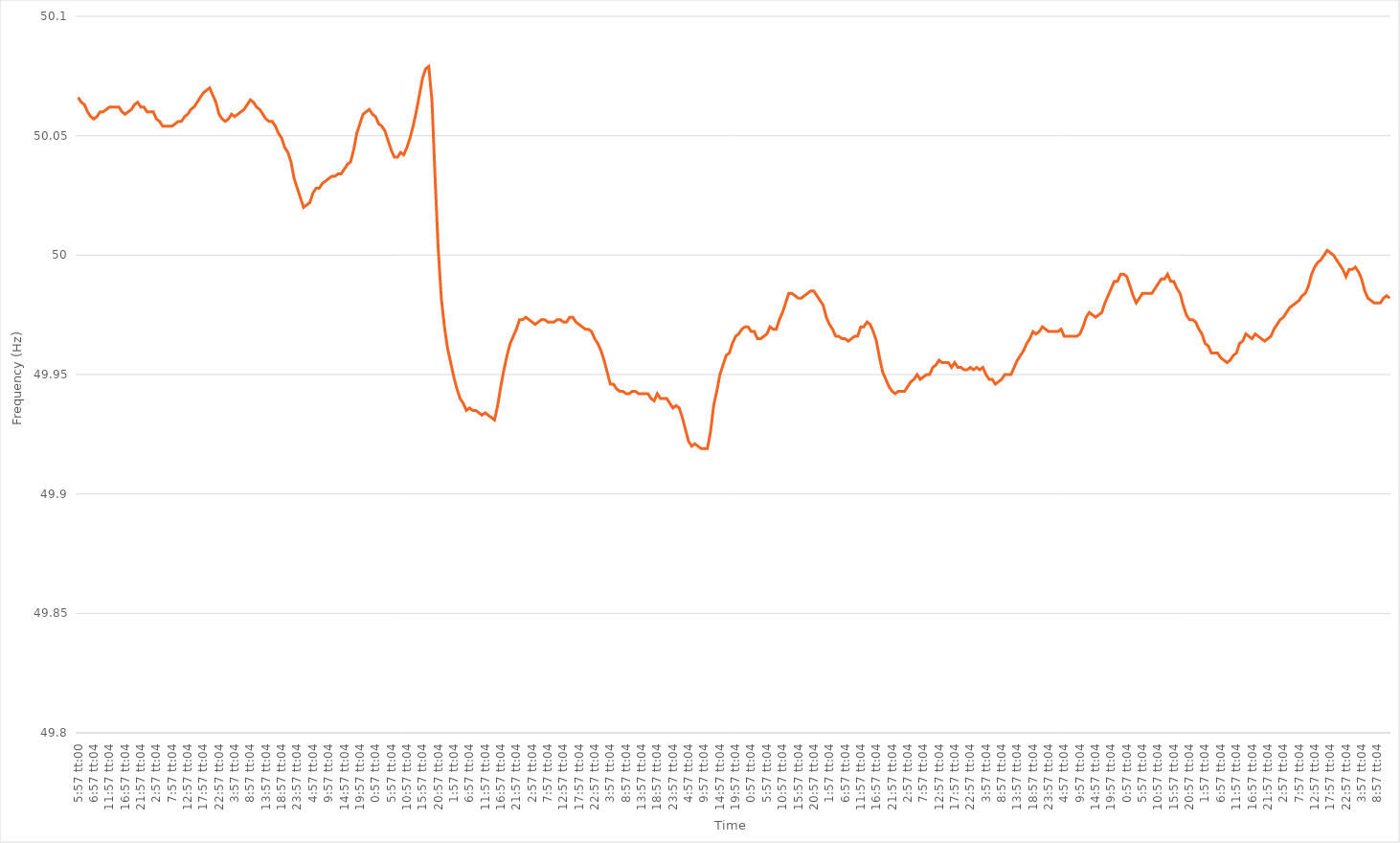
| Category | Series 0 |
|---|---|
| 0.24791666666666667 | 50.066 |
| 0.24792824074074074 | 50.064 |
| 0.24793981481481484 | 50.063 |
| 0.2479513888888889 | 50.06 |
| 0.24796296296296297 | 50.058 |
| 0.28962962962963 | 50.057 |
| 0.331296296296296 | 50.058 |
| 0.372962962962963 | 50.06 |
| 0.41462962962963 | 50.06 |
| 0.456296296296296 | 50.061 |
| 0.497962962962963 | 50.062 |
| 0.53962962962963 | 50.062 |
| 0.581296296296296 | 50.062 |
| 0.622962962962963 | 50.062 |
| 0.66462962962963 | 50.06 |
| 0.706296296296296 | 50.059 |
| 0.747962962962963 | 50.06 |
| 0.78962962962963 | 50.061 |
| 0.831296296296296 | 50.063 |
| 0.872962962962963 | 50.064 |
| 0.91462962962963 | 50.062 |
| 0.956296296296296 | 50.062 |
| 0.997962962962963 | 50.06 |
| 1900-01-01 00:57:04 | 50.06 |
| 1900-01-01 01:57:04 | 50.06 |
| 1900-01-01 02:57:04 | 50.057 |
| 1900-01-01 03:57:04 | 50.056 |
| 1900-01-01 04:57:04 | 50.054 |
| 1900-01-01 05:57:04 | 50.054 |
| 1900-01-01 06:57:04 | 50.054 |
| 1900-01-01 07:57:04 | 50.054 |
| 1900-01-01 08:57:04 | 50.055 |
| 1900-01-01 09:57:04 | 50.056 |
| 1900-01-01 10:57:04 | 50.056 |
| 1900-01-01 11:57:04 | 50.058 |
| 1900-01-01 12:57:04 | 50.059 |
| 1900-01-01 13:57:04 | 50.061 |
| 1900-01-01 14:57:04 | 50.062 |
| 1900-01-01 15:57:04 | 50.064 |
| 1900-01-01 16:57:04 | 50.066 |
| 1900-01-01 17:57:04 | 50.068 |
| 1900-01-01 18:57:04 | 50.069 |
| 1900-01-01 19:57:04 | 50.07 |
| 1900-01-01 20:57:04 | 50.067 |
| 1900-01-01 21:57:04 | 50.064 |
| 1900-01-01 22:57:04 | 50.059 |
| 1900-01-01 23:57:04 | 50.057 |
| 1900-01-02 00:57:04 | 50.056 |
| 1900-01-02 01:57:04 | 50.057 |
| 1900-01-02 02:57:04 | 50.059 |
| 1900-01-02 03:57:04 | 50.058 |
| 1900-01-02 04:57:04 | 50.059 |
| 1900-01-02 05:57:04 | 50.06 |
| 1900-01-02 06:57:04 | 50.061 |
| 1900-01-02 07:57:04 | 50.063 |
| 1900-01-02 08:57:04 | 50.065 |
| 1900-01-02 09:57:04 | 50.064 |
| 1900-01-02 10:57:04 | 50.062 |
| 1900-01-02 11:57:04 | 50.061 |
| 1900-01-02 12:57:04 | 50.059 |
| 1900-01-02 13:57:04 | 50.057 |
| 1900-01-02 14:57:04 | 50.056 |
| 1900-01-02 15:57:04 | 50.056 |
| 1900-01-02 16:57:04 | 50.054 |
| 1900-01-02 17:57:04 | 50.051 |
| 1900-01-02 18:57:04 | 50.049 |
| 1900-01-02 19:57:04 | 50.045 |
| 1900-01-02 20:57:04 | 50.043 |
| 1900-01-02 21:57:04 | 50.039 |
| 1900-01-02 22:57:04 | 50.032 |
| 1900-01-02 23:57:04 | 50.028 |
| 1900-01-03 00:57:04 | 50.024 |
| 1900-01-03 01:57:04 | 50.02 |
| 1900-01-03 02:57:04 | 50.021 |
| 1900-01-03 03:57:04 | 50.022 |
| 1900-01-03 04:57:04 | 50.026 |
| 1900-01-03 05:57:04 | 50.028 |
| 1900-01-03 06:57:04 | 50.028 |
| 1900-01-03 07:57:04 | 50.03 |
| 1900-01-03 08:57:04 | 50.031 |
| 1900-01-03 09:57:04 | 50.032 |
| 1900-01-03 10:57:04 | 50.033 |
| 1900-01-03 11:57:04 | 50.033 |
| 1900-01-03 12:57:04 | 50.034 |
| 1900-01-03 13:57:04 | 50.034 |
| 1900-01-03 14:57:04 | 50.036 |
| 1900-01-03 15:57:04 | 50.038 |
| 1900-01-03 16:57:04 | 50.039 |
| 1900-01-03 17:57:04 | 50.044 |
| 1900-01-03 18:57:04 | 50.051 |
| 1900-01-03 19:57:04 | 50.055 |
| 1900-01-03 20:57:04 | 50.059 |
| 1900-01-03 21:57:04 | 50.06 |
| 1900-01-03 22:57:04 | 50.061 |
| 1900-01-03 23:57:04 | 50.059 |
| 1900-01-04 00:57:04 | 50.058 |
| 1900-01-04 01:57:04 | 50.055 |
| 1900-01-04 02:57:04 | 50.054 |
| 1900-01-04 03:57:04 | 50.052 |
| 1900-01-04 04:57:04 | 50.048 |
| 1900-01-04 05:57:04 | 50.044 |
| 1900-01-04 06:57:04 | 50.041 |
| 1900-01-04 07:57:04 | 50.041 |
| 1900-01-04 08:57:04 | 50.043 |
| 1900-01-04 09:57:04 | 50.042 |
| 1900-01-04 10:57:04 | 50.045 |
| 1900-01-04 11:57:04 | 50.049 |
| 1900-01-04 12:57:04 | 50.054 |
| 1900-01-04 13:57:04 | 50.06 |
| 1900-01-04 14:57:04 | 50.067 |
| 1900-01-04 15:57:04 | 50.074 |
| 1900-01-04 16:57:04 | 50.078 |
| 1900-01-04 17:57:04 | 50.079 |
| 1900-01-04 18:57:04 | 50.065 |
| 1900-01-04 19:57:04 | 50.033 |
| 1900-01-04 20:57:04 | 50.003 |
| 1900-01-04 21:57:04 | 49.982 |
| 1900-01-04 22:57:04 | 49.97 |
| 1900-01-04 23:57:04 | 49.961 |
| 1900-01-05 00:57:04 | 49.955 |
| 1900-01-05 01:57:04 | 49.949 |
| 1900-01-05 02:57:04 | 49.944 |
| 1900-01-05 03:57:04 | 49.94 |
| 1900-01-05 04:57:04 | 49.938 |
| 1900-01-05 05:57:04 | 49.935 |
| 1900-01-05 06:57:04 | 49.936 |
| 1900-01-05 07:57:04 | 49.935 |
| 1900-01-05 08:57:04 | 49.935 |
| 1900-01-05 09:57:04 | 49.934 |
| 1900-01-05 10:57:04 | 49.933 |
| 1900-01-05 11:57:04 | 49.934 |
| 1900-01-05 12:57:04 | 49.933 |
| 1900-01-05 13:57:04 | 49.932 |
| 1900-01-05 14:57:04 | 49.931 |
| 1900-01-05 15:57:04 | 49.937 |
| 1900-01-05 16:57:04 | 49.945 |
| 1900-01-05 17:57:04 | 49.952 |
| 1900-01-05 18:57:04 | 49.958 |
| 1900-01-05 19:57:04 | 49.963 |
| 1900-01-05 20:57:04 | 49.966 |
| 1900-01-05 21:57:04 | 49.969 |
| 1900-01-05 22:57:04 | 49.973 |
| 1900-01-05 23:57:04 | 49.973 |
| 1900-01-06 00:57:04 | 49.974 |
| 1900-01-06 01:57:04 | 49.973 |
| 1900-01-06 02:57:04 | 49.972 |
| 1900-01-06 03:57:04 | 49.971 |
| 1900-01-06 04:57:04 | 49.972 |
| 1900-01-06 05:57:04 | 49.973 |
| 1900-01-06 06:57:04 | 49.973 |
| 1900-01-06 07:57:04 | 49.972 |
| 1900-01-06 08:57:04 | 49.972 |
| 1900-01-06 09:57:04 | 49.972 |
| 1900-01-06 10:57:04 | 49.973 |
| 1900-01-06 11:57:04 | 49.973 |
| 1900-01-06 12:57:04 | 49.972 |
| 1900-01-06 13:57:04 | 49.972 |
| 1900-01-06 14:57:04 | 49.974 |
| 1900-01-06 15:57:04 | 49.974 |
| 1900-01-06 16:57:04 | 49.972 |
| 1900-01-06 17:57:04 | 49.971 |
| 1900-01-06 18:57:04 | 49.97 |
| 1900-01-06 19:57:04 | 49.969 |
| 1900-01-06 20:57:04 | 49.969 |
| 1900-01-06 21:57:04 | 49.968 |
| 1900-01-06 22:57:04 | 49.965 |
| 1900-01-06 23:57:04 | 49.963 |
| 1900-01-07 00:57:04 | 49.96 |
| 1900-01-07 01:57:04 | 49.956 |
| 1900-01-07 02:57:04 | 49.951 |
| 1900-01-07 03:57:04 | 49.946 |
| 1900-01-07 04:57:04 | 49.946 |
| 1900-01-07 05:57:04 | 49.944 |
| 1900-01-07 06:57:04 | 49.943 |
| 1900-01-07 07:57:04 | 49.943 |
| 1900-01-07 08:57:04 | 49.942 |
| 1900-01-07 09:57:04 | 49.942 |
| 1900-01-07 10:57:04 | 49.943 |
| 1900-01-07 11:57:04 | 49.943 |
| 1900-01-07 12:57:04 | 49.942 |
| 1900-01-07 13:57:04 | 49.942 |
| 1900-01-07 14:57:04 | 49.942 |
| 1900-01-07 15:57:04 | 49.942 |
| 1900-01-07 16:57:04 | 49.94 |
| 1900-01-07 17:57:04 | 49.939 |
| 1900-01-07 18:57:04 | 49.942 |
| 1900-01-07 19:57:04 | 49.94 |
| 1900-01-07 20:57:04 | 49.94 |
| 1900-01-07 21:57:04 | 49.94 |
| 1900-01-07 22:57:04 | 49.938 |
| 1900-01-07 23:57:04 | 49.936 |
| 1900-01-08 00:57:04 | 49.937 |
| 1900-01-08 01:57:04 | 49.936 |
| 1900-01-08 02:57:04 | 49.932 |
| 1900-01-08 03:57:04 | 49.927 |
| 1900-01-08 04:57:04 | 49.922 |
| 1900-01-08 05:57:04 | 49.92 |
| 1900-01-08 06:57:04 | 49.921 |
| 1900-01-08 07:57:04 | 49.92 |
| 1900-01-08 08:57:04 | 49.919 |
| 1900-01-08 09:57:04 | 49.919 |
| 1900-01-08 10:57:04 | 49.919 |
| 1900-01-08 11:57:04 | 49.926 |
| 1900-01-08 12:57:04 | 49.937 |
| 1900-01-08 13:57:04 | 49.943 |
| 1900-01-08 14:57:04 | 49.95 |
| 1900-01-08 15:57:04 | 49.954 |
| 1900-01-08 16:57:04 | 49.958 |
| 1900-01-08 17:57:04 | 49.959 |
| 1900-01-08 18:57:04 | 49.963 |
| 1900-01-08 19:57:04 | 49.966 |
| 1900-01-08 20:57:04 | 49.967 |
| 1900-01-08 21:57:04 | 49.969 |
| 1900-01-08 22:57:04 | 49.97 |
| 1900-01-08 23:57:04 | 49.97 |
| 1900-01-09 00:57:04 | 49.968 |
| 1900-01-09 01:57:04 | 49.968 |
| 1900-01-09 02:57:04 | 49.965 |
| 1900-01-09 03:57:04 | 49.965 |
| 1900-01-09 04:57:04 | 49.966 |
| 1900-01-09 05:57:04 | 49.967 |
| 1900-01-09 06:57:04 | 49.97 |
| 1900-01-09 07:57:04 | 49.969 |
| 1900-01-09 08:57:04 | 49.969 |
| 1900-01-09 09:57:04 | 49.973 |
| 1900-01-09 10:57:04 | 49.976 |
| 1900-01-09 11:57:04 | 49.98 |
| 1900-01-09 12:57:04 | 49.984 |
| 1900-01-09 13:57:04 | 49.984 |
| 1900-01-09 14:57:04 | 49.983 |
| 1900-01-09 15:57:04 | 49.982 |
| 1900-01-09 16:57:04 | 49.982 |
| 1900-01-09 17:57:04 | 49.983 |
| 1900-01-09 18:57:04 | 49.984 |
| 1900-01-09 19:57:04 | 49.985 |
| 1900-01-09 20:57:04 | 49.985 |
| 1900-01-09 21:57:04 | 49.983 |
| 1900-01-09 22:57:04 | 49.981 |
| 1900-01-09 23:57:04 | 49.979 |
| 1900-01-10 00:57:04 | 49.974 |
| 1900-01-10 01:57:04 | 49.971 |
| 1900-01-10 02:57:04 | 49.969 |
| 1900-01-10 03:57:04 | 49.966 |
| 1900-01-10 04:57:04 | 49.966 |
| 1900-01-10 05:57:04 | 49.965 |
| 1900-01-10 06:57:04 | 49.965 |
| 1900-01-10 07:57:04 | 49.964 |
| 1900-01-10 08:57:04 | 49.965 |
| 1900-01-10 09:57:04 | 49.966 |
| 1900-01-10 10:57:04 | 49.966 |
| 1900-01-10 11:57:04 | 49.97 |
| 1900-01-10 12:57:04 | 49.97 |
| 1900-01-10 13:57:04 | 49.972 |
| 1900-01-10 14:57:04 | 49.971 |
| 1900-01-10 15:57:04 | 49.968 |
| 1900-01-10 16:57:04 | 49.964 |
| 1900-01-10 17:57:04 | 49.957 |
| 1900-01-10 18:57:04 | 49.951 |
| 1900-01-10 19:57:04 | 49.948 |
| 1900-01-10 20:57:04 | 49.945 |
| 1900-01-10 21:57:04 | 49.943 |
| 1900-01-10 22:57:04 | 49.942 |
| 1900-01-10 23:57:04 | 49.943 |
| 1900-01-11 00:57:04 | 49.943 |
| 1900-01-11 01:57:04 | 49.943 |
| 1900-01-11 02:57:04 | 49.945 |
| 1900-01-11 03:57:04 | 49.947 |
| 1900-01-11 04:57:04 | 49.948 |
| 1900-01-11 05:57:04 | 49.95 |
| 1900-01-11 06:57:04 | 49.948 |
| 1900-01-11 07:57:04 | 49.949 |
| 1900-01-11 08:57:04 | 49.95 |
| 1900-01-11 09:57:04 | 49.95 |
| 1900-01-11 10:57:04 | 49.953 |
| 1900-01-11 11:57:04 | 49.954 |
| 1900-01-11 12:57:04 | 49.956 |
| 1900-01-11 13:57:04 | 49.955 |
| 1900-01-11 14:57:04 | 49.955 |
| 1900-01-11 15:57:04 | 49.955 |
| 1900-01-11 16:57:04 | 49.953 |
| 1900-01-11 17:57:04 | 49.955 |
| 1900-01-11 18:57:04 | 49.953 |
| 1900-01-11 19:57:04 | 49.953 |
| 1900-01-11 20:57:04 | 49.952 |
| 1900-01-11 21:57:04 | 49.952 |
| 1900-01-11 22:57:04 | 49.953 |
| 1900-01-11 23:57:04 | 49.952 |
| 1900-01-12 00:57:04 | 49.953 |
| 1900-01-12 01:57:04 | 49.952 |
| 1900-01-12 02:57:04 | 49.953 |
| 1900-01-12 03:57:04 | 49.95 |
| 1900-01-12 04:57:04 | 49.948 |
| 1900-01-12 05:57:04 | 49.948 |
| 1900-01-12 06:57:04 | 49.946 |
| 1900-01-12 07:57:04 | 49.947 |
| 1900-01-12 08:57:04 | 49.948 |
| 1900-01-12 09:57:04 | 49.95 |
| 1900-01-12 10:57:04 | 49.95 |
| 1900-01-12 11:57:04 | 49.95 |
| 1900-01-12 12:57:04 | 49.953 |
| 1900-01-12 13:57:04 | 49.956 |
| 1900-01-12 14:57:04 | 49.958 |
| 1900-01-12 15:57:04 | 49.96 |
| 1900-01-12 16:57:04 | 49.963 |
| 1900-01-12 17:57:04 | 49.965 |
| 1900-01-12 18:57:04 | 49.968 |
| 1900-01-12 19:57:04 | 49.967 |
| 1900-01-12 20:57:04 | 49.968 |
| 1900-01-12 21:57:04 | 49.97 |
| 1900-01-12 22:57:04 | 49.969 |
| 1900-01-12 23:57:04 | 49.968 |
| 1900-01-13 00:57:04 | 49.968 |
| 1900-01-13 01:57:04 | 49.968 |
| 1900-01-13 02:57:04 | 49.968 |
| 1900-01-13 03:57:04 | 49.969 |
| 1900-01-13 04:57:04 | 49.966 |
| 1900-01-13 05:57:04 | 49.966 |
| 1900-01-13 06:57:04 | 49.966 |
| 1900-01-13 07:57:04 | 49.966 |
| 1900-01-13 08:57:04 | 49.966 |
| 1900-01-13 09:57:04 | 49.967 |
| 1900-01-13 10:57:04 | 49.97 |
| 1900-01-13 11:57:04 | 49.974 |
| 1900-01-13 12:57:04 | 49.976 |
| 1900-01-13 13:57:04 | 49.975 |
| 1900-01-13 14:57:04 | 49.974 |
| 1900-01-13 15:57:04 | 49.975 |
| 1900-01-13 16:57:04 | 49.976 |
| 1900-01-13 17:57:04 | 49.98 |
| 1900-01-13 18:57:04 | 49.983 |
| 1900-01-13 19:57:04 | 49.986 |
| 1900-01-13 20:57:04 | 49.989 |
| 1900-01-13 21:57:04 | 49.989 |
| 1900-01-13 22:57:04 | 49.992 |
| 1900-01-13 23:57:04 | 49.992 |
| 1900-01-14 00:57:04 | 49.991 |
| 1900-01-14 01:57:04 | 49.987 |
| 1900-01-14 02:57:04 | 49.983 |
| 1900-01-14 03:57:04 | 49.98 |
| 1900-01-14 04:57:04 | 49.982 |
| 1900-01-14 05:57:04 | 49.984 |
| 1900-01-14 06:57:04 | 49.984 |
| 1900-01-14 07:57:04 | 49.984 |
| 1900-01-14 08:57:04 | 49.984 |
| 1900-01-14 09:57:04 | 49.986 |
| 1900-01-14 10:57:04 | 49.988 |
| 1900-01-14 11:57:04 | 49.99 |
| 1900-01-14 12:57:04 | 49.99 |
| 1900-01-14 13:57:04 | 49.992 |
| 1900-01-14 14:57:04 | 49.989 |
| 1900-01-14 15:57:04 | 49.989 |
| 1900-01-14 16:57:04 | 49.986 |
| 1900-01-14 17:57:04 | 49.984 |
| 1900-01-14 18:57:04 | 49.979 |
| 1900-01-14 19:57:04 | 49.975 |
| 1900-01-14 20:57:04 | 49.973 |
| 1900-01-14 21:57:04 | 49.973 |
| 1900-01-14 22:57:04 | 49.972 |
| 1900-01-14 23:57:04 | 49.969 |
| 1900-01-15 00:57:04 | 49.967 |
| 1900-01-15 01:57:04 | 49.963 |
| 1900-01-15 02:57:04 | 49.962 |
| 1900-01-15 03:57:04 | 49.959 |
| 1900-01-15 04:57:04 | 49.959 |
| 1900-01-15 05:57:04 | 49.959 |
| 1900-01-15 06:57:04 | 49.957 |
| 1900-01-15 07:57:04 | 49.956 |
| 1900-01-15 08:57:04 | 49.955 |
| 1900-01-15 09:57:04 | 49.956 |
| 1900-01-15 10:57:04 | 49.958 |
| 1900-01-15 11:57:04 | 49.959 |
| 1900-01-15 12:57:04 | 49.963 |
| 1900-01-15 13:57:04 | 49.964 |
| 1900-01-15 14:57:04 | 49.967 |
| 1900-01-15 15:57:04 | 49.966 |
| 1900-01-15 16:57:04 | 49.965 |
| 1900-01-15 17:57:04 | 49.967 |
| 1900-01-15 18:57:04 | 49.966 |
| 1900-01-15 19:57:04 | 49.965 |
| 1900-01-15 20:57:04 | 49.964 |
| 1900-01-15 21:57:04 | 49.965 |
| 1900-01-15 22:57:04 | 49.966 |
| 1900-01-15 23:57:04 | 49.969 |
| 1900-01-16 00:57:04 | 49.971 |
| 1900-01-16 01:57:04 | 49.973 |
| 1900-01-16 02:57:04 | 49.974 |
| 1900-01-16 03:57:04 | 49.976 |
| 1900-01-16 04:57:04 | 49.978 |
| 1900-01-16 05:57:04 | 49.979 |
| 1900-01-16 06:57:04 | 49.98 |
| 1900-01-16 07:57:04 | 49.981 |
| 1900-01-16 08:57:04 | 49.983 |
| 1900-01-16 09:57:04 | 49.984 |
| 1900-01-16 10:57:04 | 49.987 |
| 1900-01-16 11:57:04 | 49.992 |
| 1900-01-16 12:57:04 | 49.995 |
| 1900-01-16 13:57:04 | 49.997 |
| 1900-01-16 14:57:04 | 49.998 |
| 1900-01-16 15:57:04 | 50 |
| 1900-01-16 16:57:04 | 50.002 |
| 1900-01-16 17:57:04 | 50.001 |
| 1900-01-16 18:57:04 | 50 |
| 1900-01-16 19:57:04 | 49.998 |
| 1900-01-16 20:57:04 | 49.996 |
| 1900-01-16 21:57:04 | 49.994 |
| 1900-01-16 22:57:04 | 49.991 |
| 1900-01-16 23:57:04 | 49.994 |
| 1900-01-17 00:57:04 | 49.994 |
| 1900-01-17 01:57:04 | 49.995 |
| 1900-01-17 02:57:04 | 49.993 |
| 1900-01-17 03:57:04 | 49.99 |
| 1900-01-17 04:57:04 | 49.985 |
| 1900-01-17 05:57:04 | 49.982 |
| 1900-01-17 06:57:04 | 49.981 |
| 1900-01-17 07:57:04 | 49.98 |
| 1900-01-17 08:57:04 | 49.98 |
| 1900-01-17 09:57:04 | 49.98 |
| 1900-01-17 10:57:04 | 49.982 |
| 1900-01-17 11:57:04 | 49.983 |
| 1900-01-17 12:57:04 | 49.982 |